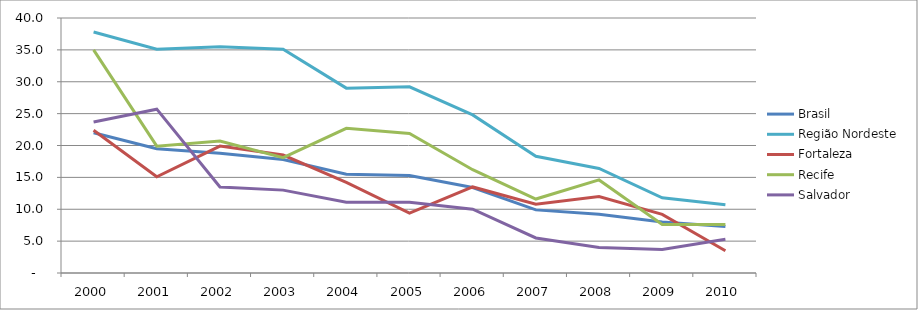
| Category | Brasil | Região Nordeste | Fortaleza | Recife | Salvador |
|---|---|---|---|---|---|
| 2000.0 | 22 | 37.8 | 22.4 | 35 | 23.7 |
| 2001.0 | 19.5 | 35.1 | 15.1 | 19.9 | 25.7 |
| 2002.0 | 18.8 | 35.5 | 19.9 | 20.7 | 13.5 |
| 2003.0 | 17.8 | 35.1 | 18.5 | 18.1 | 13 |
| 2004.0 | 15.5 | 29 | 14.2 | 22.7 | 11.1 |
| 2005.0 | 15.3 | 29.2 | 9.4 | 21.9 | 11.1 |
| 2006.0 | 13.4 | 24.8 | 13.5 | 16.2 | 10 |
| 2007.0 | 9.9 | 18.3 | 10.8 | 11.6 | 5.5 |
| 2008.0 | 9.2 | 16.4 | 12 | 14.6 | 4 |
| 2009.0 | 8 | 11.8 | 9.2 | 7.6 | 3.7 |
| 2010.0 | 7.3 | 10.7 | 3.5 | 7.6 | 5.3 |